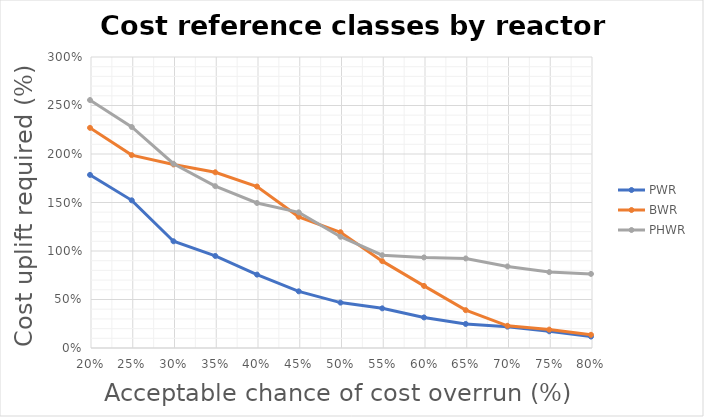
| Category | PWR | BWR | PHWR |
|---|---|---|---|
| 0.8 | 0.118 | 0.136 | 0.764 |
| 0.75 | 0.173 | 0.19 | 0.782 |
| 0.7 | 0.22 | 0.229 | 0.841 |
| 0.65 | 0.248 | 0.39 | 0.923 |
| 0.6 | 0.315 | 0.64 | 0.934 |
| 0.55 | 0.409 | 0.895 | 0.957 |
| 0.5 | 0.468 | 1.194 | 1.147 |
| 0.45 | 0.584 | 1.352 | 1.399 |
| 0.399999999999999 | 0.757 | 1.665 | 1.495 |
| 0.349999999999999 | 0.949 | 1.812 | 1.668 |
| 0.299999999999999 | 1.1 | 1.892 | 1.899 |
| 0.249999999999999 | 1.522 | 1.989 | 2.278 |
| 0.199999999999999 | 1.785 | 2.27 | 2.556 |